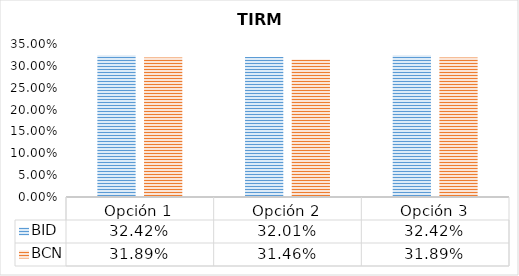
| Category | BID | BCN |
|---|---|---|
| Opción 1 | 0.324 | 0.319 |
| Opción 2 | 0.32 | 0.315 |
| Opción 3 | 0.324 | 0.319 |